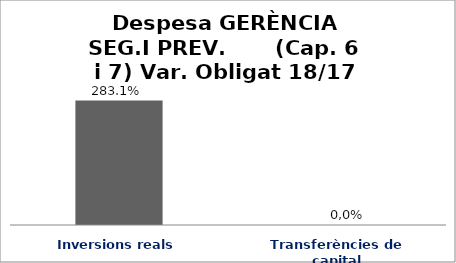
| Category | Series 0 |
|---|---|
| Inversions reals | 2.831 |
| Transferències de capital | 0 |